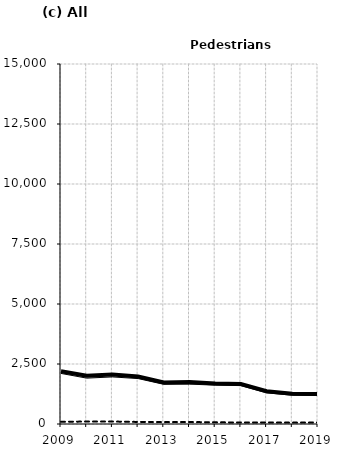
| Category | Built-up | Non built-up | Total |
|---|---|---|---|
| 2009.0 | 2107 | 92 | 2199 |
| 2010.0 | 1911 | 102 | 2013 |
| 2011.0 | 1962 | 103 | 2065 |
| 2012.0 | 1893 | 86 | 1979 |
| 2013.0 | 1653 | 81 | 1734 |
| 2014.0 | 1662 | 83 | 1745 |
| 2015.0 | 1619 | 71 | 1690 |
| 2016.0 | 1600 | 63 | 1663 |
| 2017.0 | 1298 | 65 | 1363 |
| 2018.0 | 1199 | 57 | 1256 |
| 2019.0 | 1186 | 64 | 1250 |